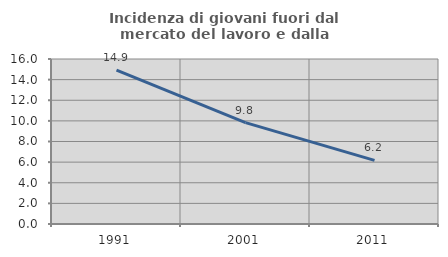
| Category | Incidenza di giovani fuori dal mercato del lavoro e dalla formazione  |
|---|---|
| 1991.0 | 14.912 |
| 2001.0 | 9.836 |
| 2011.0 | 6.173 |